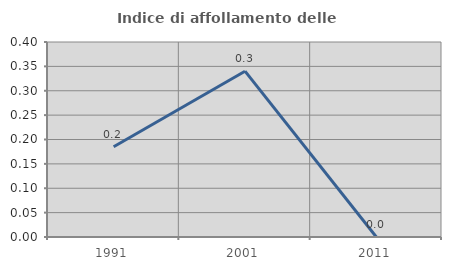
| Category | Indice di affollamento delle abitazioni  |
|---|---|
| 1991.0 | 0.185 |
| 2001.0 | 0.34 |
| 2011.0 | 0 |